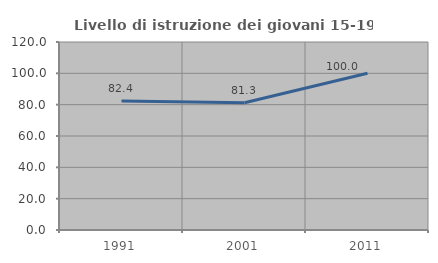
| Category | Livello di istruzione dei giovani 15-19 anni |
|---|---|
| 1991.0 | 82.353 |
| 2001.0 | 81.25 |
| 2011.0 | 100 |